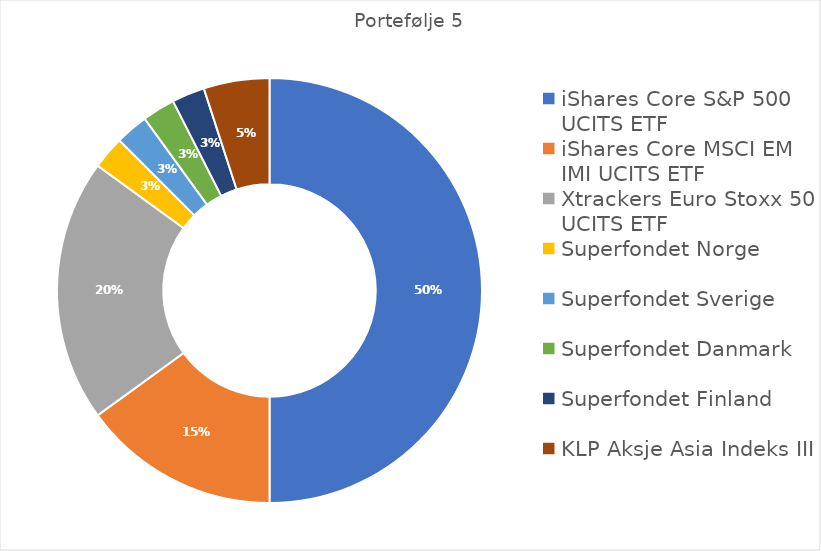
| Category | Series 0 |
|---|---|
| iShares Core S&P 500 UCITS ETF | 0.5 |
| iShares Core MSCI EM IMI UCITS ETF | 0.15 |
| Xtrackers Euro Stoxx 50 UCITS ETF | 0.2 |
| Superfondet Norge | 0.025 |
| Superfondet Sverige | 0.025 |
| Superfondet Danmark | 0.025 |
| Superfondet Finland | 0.025 |
| KLP Aksje Asia Indeks III  | 0.05 |